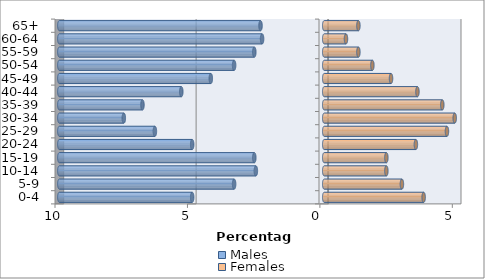
| Category | Males | Females |
|---|---|---|
| 0-4 | -4.985 | 3.754 |
| 5-9 | -3.402 | 2.933 |
| 10-14 | -2.581 | 2.346 |
| 15-19 | -2.639 | 2.346 |
| 20-24 | -4.985 | 3.46 |
| 25-29 | -6.393 | 4.633 |
| 30-34 | -7.566 | 4.927 |
| 35-39 | -6.862 | 4.457 |
| 40-44 | -5.396 | 3.519 |
| 45-49 | -4.282 | 2.522 |
| 50-54 | -3.402 | 1.818 |
| 55-59 | -2.639 | 1.29 |
| 60-64 | -2.346 | 0.821 |
| 65+ | -2.405 | 1.29 |